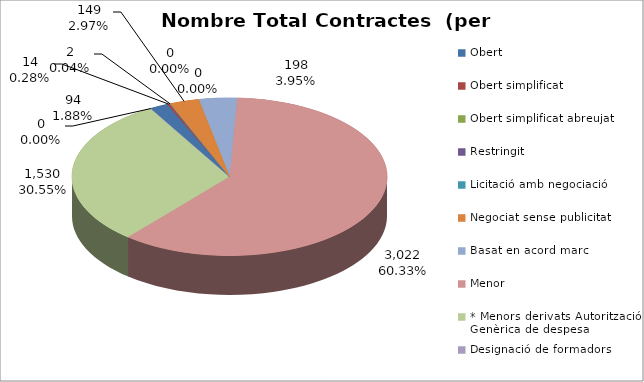
| Category | Nombre Total Contractes |
|---|---|
| Obert | 94 |
| Obert simplificat | 14 |
| Obert simplificat abreujat | 2 |
| Restringit | 0 |
| Licitació amb negociació | 0 |
| Negociat sense publicitat | 149 |
| Basat en acord marc | 198 |
| Menor | 3022 |
| * Menors derivats Autorització Genèrica de despesa | 1530 |
| Designació de formadors | 0 |